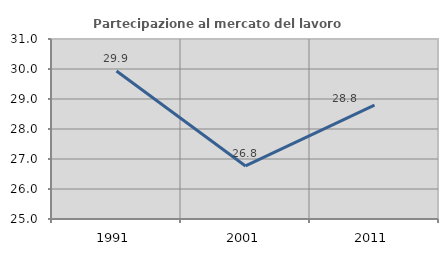
| Category | Partecipazione al mercato del lavoro  femminile |
|---|---|
| 1991.0 | 29.931 |
| 2001.0 | 26.769 |
| 2011.0 | 28.797 |